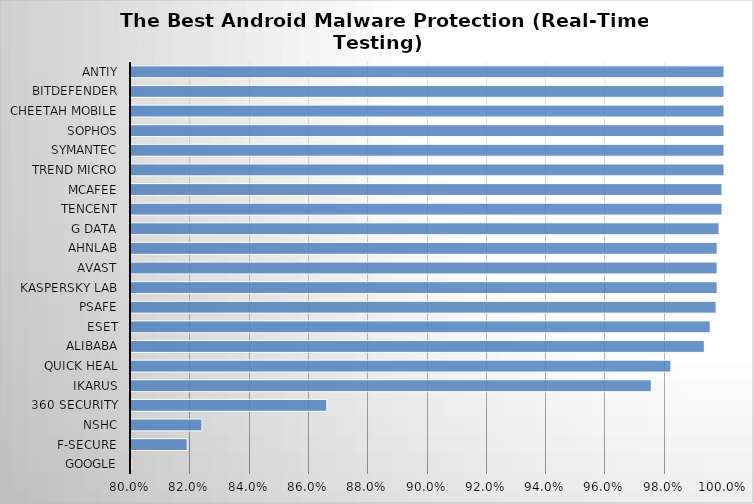
| Category | Series 0 |
|---|---|
| Google | 0.658 |
| F-Secure | 0.819 |
| NSHC | 0.824 |
| 360 Security | 0.866 |
| Ikarus | 0.975 |
| Quick Heal | 0.982 |
| Alibaba | 0.993 |
| ESET | 0.995 |
| PSafe | 0.997 |
| Kaspersky Lab | 0.998 |
| Avast | 0.998 |
| AhnLab | 0.998 |
| G Data | 0.998 |
| Tencent | 0.999 |
| McAfee | 0.999 |
| Trend Micro | 1 |
| Symantec | 1 |
| Sophos | 1 |
| Cheetah Mobile | 1 |
| Bitdefender | 1 |
| Antiy | 1 |